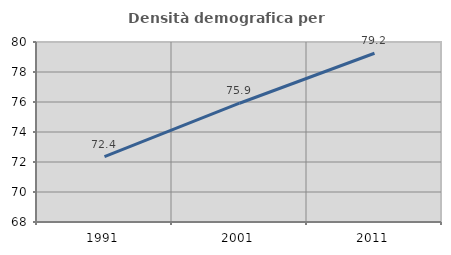
| Category | Densità demografica |
|---|---|
| 1991.0 | 72.358 |
| 2001.0 | 75.919 |
| 2011.0 | 79.249 |